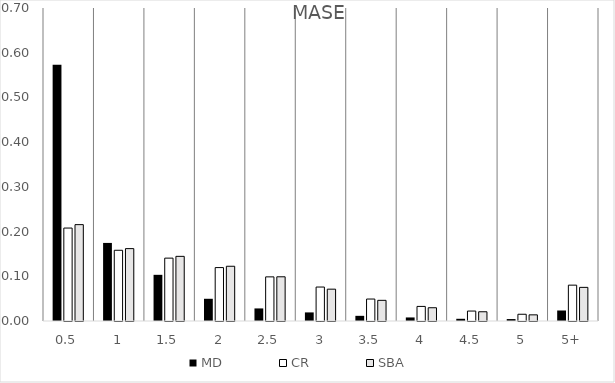
| Category | MD | CR | SBA |
|---|---|---|---|
| 0,5 | 0.573 | 0.208 | 0.216 |
| 1 | 0.175 | 0.158 | 0.162 |
| 1,5 | 0.103 | 0.141 | 0.145 |
| 2 | 0.05 | 0.119 | 0.122 |
| 2,5 | 0.028 | 0.099 | 0.099 |
| 3 | 0.019 | 0.076 | 0.071 |
| 3,5 | 0.012 | 0.049 | 0.046 |
| 4 | 0.008 | 0.033 | 0.03 |
| 4,5 | 0.005 | 0.022 | 0.021 |
| 5 | 0.004 | 0.015 | 0.014 |
| 5+ | 0.023 | 0.08 | 0.075 |